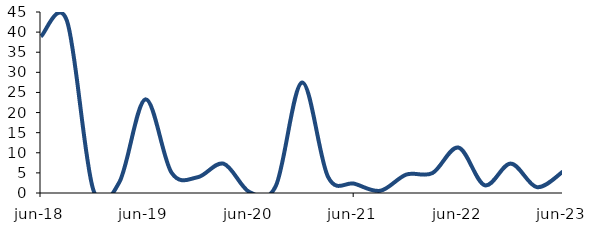
| Category | Series 0 |
|---|---|
| 2018-06-01 | 38.93 |
| 2018-09-01 | 42.687 |
| 2018-12-01 | 0.868 |
| 2019-03-01 | 2.666 |
| 2019-06-01 | 23.282 |
| 2019-09-01 | 5.079 |
| 2019-12-01 | 3.913 |
| 2020-03-01 | 7.276 |
| 2020-06-01 | 0.188 |
| 2020-09-01 | 1.792 |
| 2020-12-01 | 27.467 |
| 2021-03-01 | 3.974 |
| 2021-06-01 | 2.326 |
| 2021-09-01 | 0.557 |
| 2021-12-01 | 4.59 |
| 2022-03-01 | 4.966 |
| 2022-06-01 | 11.286 |
| 2022-09-01 | 1.93 |
| 2022-12-01 | 7.313 |
| 2023-03-01 | 1.455 |
| 2023-06-01 | 5.33 |